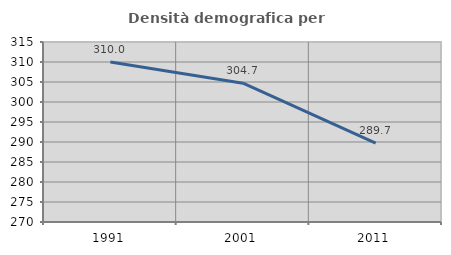
| Category | Densità demografica |
|---|---|
| 1991.0 | 309.979 |
| 2001.0 | 304.704 |
| 2011.0 | 289.707 |